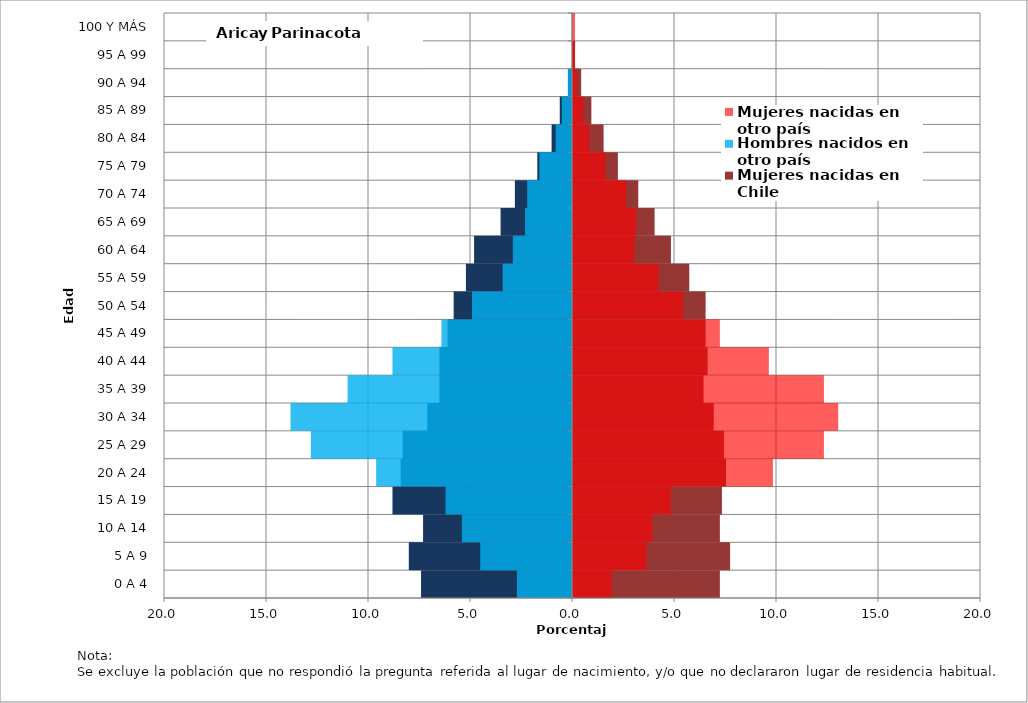
| Category | Hombres nacidos en Chile | Mujeres nacidas en Chile | Hombres nacidos en otro país | Mujeres nacidas en otro país |
|---|---|---|---|---|
| 0 A 4 | -7.4 | 7.2 | -2.7 | 1.9 |
| 5 A 9 | -8 | 7.7 | -4.5 | 3.6 |
| 10 A 14 | -7.3 | 7.2 | -5.4 | 3.9 |
| 15 A 19 | -8.8 | 7.3 | -6.2 | 4.8 |
| 20 A 24 | -8.4 | 7.5 | -9.6 | 9.8 |
| 25 A 29 | -8.3 | 7.4 | -12.8 | 12.3 |
| 30 A 34 | -7.1 | 6.9 | -13.8 | 13 |
| 35 A 39 | -6.5 | 6.4 | -11 | 12.3 |
| 40 A 44 | -6.5 | 6.6 | -8.8 | 9.6 |
| 45 A 49 | -6.1 | 6.5 | -6.4 | 7.2 |
| 50 A 54 | -5.8 | 6.5 | -4.9 | 5.4 |
| 55 A 59 | -5.2 | 5.7 | -3.4 | 4.2 |
| 60 A 64 | -4.8 | 4.8 | -2.9 | 3 |
| 65 A 69 | -3.5 | 4 | -2.3 | 3.1 |
| 70 A 74 | -2.8 | 3.2 | -2.2 | 2.6 |
| 75 A 79 | -1.7 | 2.2 | -1.6 | 1.6 |
| 80 A 84 | -1 | 1.5 | -0.8 | 0.8 |
| 85 A 89 | -0.6 | 0.9 | -0.5 | 0.5 |
| 90 A 94 | -0.2 | 0.4 | -0.2 | 0.2 |
| 95 A 99 | 0 | 0.1 | 0 | 0.1 |
| 100 Y MÁS | 0 | 0 | 0 | 0.1 |